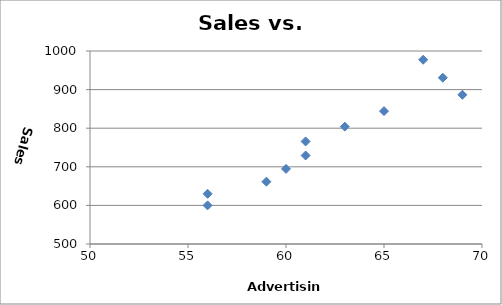
| Category | Sales |
|---|---|
| 56.0 | 600 |
| 56.0 | 630 |
| 59.0 | 661.5 |
| 60.0 | 694.575 |
| 61.0 | 729.304 |
| 61.0 | 765.769 |
| 63.0 | 804.057 |
| 65.0 | 844.26 |
| 69.0 | 886.473 |
| 68.0 | 930.797 |
| 67.0 | 977.337 |